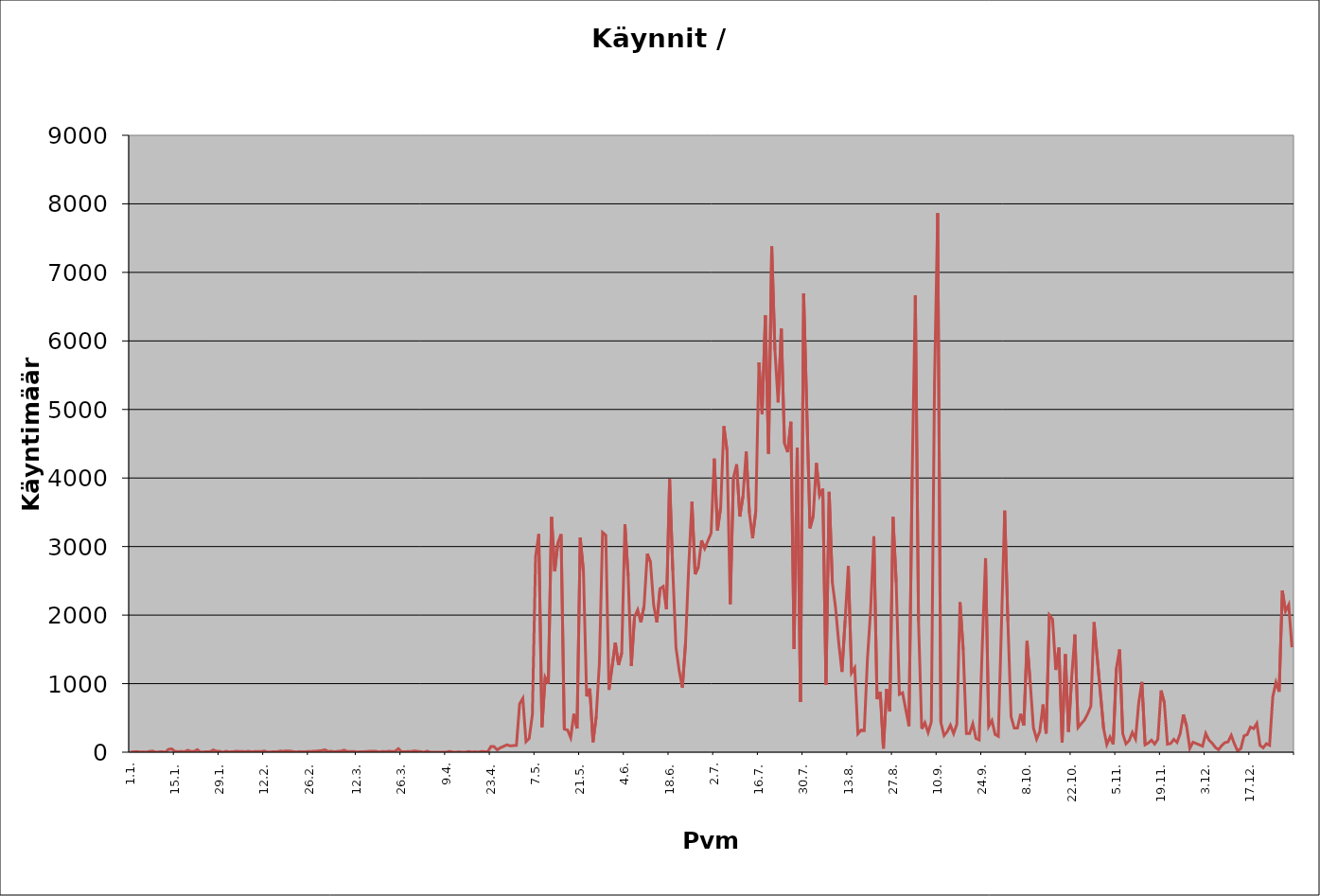
| Category | Series 1 |
|---|---|
| 0 | 3 |
| 1 | 5 |
| 2 | 9 |
| 3 | 2 |
| 4 | 4 |
| 5 | 1 |
| 6 | 12 |
| 7 | 16 |
| 8 | 0 |
| 9 | 5 |
| 10 | 6 |
| 11 | 0 |
| 12 | 42 |
| 13 | 48 |
| 14 | 10 |
| 15 | 8 |
| 16 | 12 |
| 17 | 6 |
| 18 | 28 |
| 19 | 12 |
| 20 | 11 |
| 21 | 37 |
| 22 | 1 |
| 23 | 3 |
| 24 | 8 |
| 25 | 6 |
| 26 | 33 |
| 27 | 12 |
| 28 | 13 |
| 29 | 0 |
| 30 | 14 |
| 31 | 5 |
| 32 | 6 |
| 33 | 13 |
| 34 | 12 |
| 35 | 12 |
| 36 | 7 |
| 37 | 14 |
| 38 | 6 |
| 39 | 10 |
| 40 | 11 |
| 41 | 9 |
| 42 | 18 |
| 43 | 1 |
| 44 | 4 |
| 45 | 8 |
| 46 | 7 |
| 47 | 16 |
| 48 | 13 |
| 49 | 19 |
| 50 | 18 |
| 51 | 8 |
| 52 | 3 |
| 53 | 9 |
| 54 | 7 |
| 55 | 8 |
| 56 | 11 |
| 57 | 12 |
| 58 | 14 |
| 59 | 0 |
| 60 | 24 |
| 61 | 35 |
| 62 | 11 |
| 63 | 13 |
| 64 | 6 |
| 65 | 12 |
| 66 | 14 |
| 67 | 30 |
| 68 | 8 |
| 69 | 11 |
| 70 | 12 |
| 71 | 3 |
| 72 | 7 |
| 73 | 7 |
| 74 | 10 |
| 75 | 13 |
| 76 | 13 |
| 77 | 13 |
| 78 | 3 |
| 79 | 11 |
| 80 | 8 |
| 81 | 14 |
| 82 | 11 |
| 83 | 12 |
| 84 | 51 |
| 85 | 7 |
| 86 | 6 |
| 87 | 10 |
| 88 | 9 |
| 89 | 18 |
| 90 | 0 |
| 91 | 8 |
| 92 | 0 |
| 93 | 15 |
| 94 | 0 |
| 95 | 0 |
| 96 | 0 |
| 97 | 1 |
| 98 | 0 |
| 99 | 1 |
| 100 | 12 |
| 101 | 2 |
| 102 | 0 |
| 103 | 5 |
| 104 | 0 |
| 105 | 0 |
| 106 | 10 |
| 107 | 2 |
| 108 | 6 |
| 109 | 1 |
| 110 | 10 |
| 111 | 8 |
| 112 | 4 |
| 113 | 83 |
| 114 | 82 |
| 115 | 34 |
| 116 | 66 |
| 117 | 85 |
| 118 | 108 |
| 119 | 92 |
| 120 | 0 |
| 121 | 100 |
| 122 | 705 |
| 123 | 785 |
| 124 | 153 |
| 125 | 200 |
| 126 | 550 |
| 127 | 2852 |
| 128 | 3182 |
| 129 | 366 |
| 130 | 1091 |
| 131 | 1000 |
| 132 | 3431 |
| 133 | 2642 |
| 134 | 3055 |
| 135 | 3180 |
| 136 | 336 |
| 137 | 324 |
| 138 | 214 |
| 139 | 560 |
| 140 | 346 |
| 141 | 3130 |
| 142 | 2639 |
| 143 | 814 |
| 144 | 927 |
| 145 | 147 |
| 146 | 520 |
| 147 | 1302 |
| 148 | 3206 |
| 149 | 3165 |
| 150 | 909 |
| 151 | 0 |
| 152 | 1599 |
| 153 | 1271 |
| 154 | 1446 |
| 155 | 3327 |
| 156 | 2577 |
| 157 | 1258 |
| 158 | 1973 |
| 159 | 2076 |
| 160 | 1894 |
| 161 | 2131 |
| 162 | 2896 |
| 163 | 2774 |
| 164 | 2148 |
| 165 | 1894 |
| 166 | 2386 |
| 167 | 2418 |
| 168 | 2084 |
| 169 | 3982 |
| 170 | 2648 |
| 171 | 1527 |
| 172 | 1189 |
| 173 | 943 |
| 174 | 1598 |
| 175 | 2725 |
| 176 | 3653 |
| 177 | 2596 |
| 178 | 2699 |
| 179 | 3090 |
| 180 | 2971 |
| 181 | 0 |
| 182 | 3195 |
| 183 | 4283 |
| 184 | 3233 |
| 185 | 3576 |
| 186 | 4756 |
| 187 | 4398 |
| 188 | 2159 |
| 189 | 4002 |
| 190 | 4200 |
| 191 | 3437 |
| 192 | 3734 |
| 193 | 4386 |
| 194 | 3491 |
| 195 | 3121 |
| 196 | 3515 |
| 197 | 5685 |
| 198 | 4933 |
| 199 | 6372 |
| 200 | 4356 |
| 201 | 7379 |
| 202 | 5868 |
| 203 | 5104 |
| 204 | 6179 |
| 205 | 4505 |
| 206 | 4377 |
| 207 | 4820 |
| 208 | 1504 |
| 209 | 4440 |
| 210 | 732 |
| 211 | 6690 |
| 212 | 0 |
| 213 | 3266 |
| 214 | 3445 |
| 215 | 4218 |
| 216 | 3746 |
| 217 | 3844 |
| 218 | 985 |
| 219 | 3798 |
| 220 | 2471 |
| 221 | 2111 |
| 222 | 1591 |
| 223 | 1172 |
| 224 | 1924 |
| 225 | 2717 |
| 226 | 1155 |
| 227 | 1230 |
| 228 | 270 |
| 229 | 322 |
| 230 | 316 |
| 231 | 1369 |
| 232 | 2082 |
| 233 | 3149 |
| 234 | 774 |
| 235 | 879 |
| 236 | 53 |
| 237 | 920 |
| 238 | 594 |
| 239 | 3431 |
| 240 | 2480 |
| 241 | 845 |
| 242 | 868 |
| 243 | 0 |
| 244 | 379 |
| 245 | 4023 |
| 246 | 6663 |
| 247 | 1912 |
| 248 | 341 |
| 249 | 430 |
| 250 | 287 |
| 251 | 442 |
| 252 | 5363 |
| 253 | 7864 |
| 254 | 434 |
| 255 | 243 |
| 256 | 300 |
| 257 | 394 |
| 258 | 272 |
| 259 | 408 |
| 260 | 2188 |
| 261 | 1492 |
| 262 | 274 |
| 263 | 274 |
| 264 | 415 |
| 265 | 200 |
| 266 | 179 |
| 267 | 1582 |
| 268 | 2831 |
| 269 | 377 |
| 270 | 461 |
| 271 | 260 |
| 272 | 233 |
| 273 | 0 |
| 274 | 3524 |
| 275 | 1907 |
| 276 | 516 |
| 277 | 352 |
| 278 | 351 |
| 279 | 559 |
| 280 | 392 |
| 281 | 1622 |
| 282 | 1014 |
| 283 | 355 |
| 284 | 190 |
| 285 | 301 |
| 286 | 696 |
| 287 | 273 |
| 288 | 2001 |
| 289 | 1940 |
| 290 | 1200 |
| 291 | 1525 |
| 292 | 143 |
| 293 | 1429 |
| 294 | 298 |
| 295 | 1098 |
| 296 | 1716 |
| 297 | 361 |
| 298 | 418 |
| 299 | 471 |
| 300 | 561 |
| 301 | 671 |
| 302 | 1897 |
| 303 | 0 |
| 304 | 0 |
| 305 | 344 |
| 306 | 111 |
| 307 | 221 |
| 308 | 115 |
| 309 | 1226 |
| 310 | 1497 |
| 311 | 269 |
| 312 | 121 |
| 313 | 170 |
| 314 | 288 |
| 315 | 194 |
| 316 | 722 |
| 317 | 1024 |
| 318 | 108 |
| 319 | 134 |
| 320 | 175 |
| 321 | 119 |
| 322 | 189 |
| 323 | 900 |
| 324 | 728 |
| 325 | 117 |
| 326 | 127 |
| 327 | 187 |
| 328 | 142 |
| 329 | 272 |
| 330 | 550 |
| 331 | 380 |
| 332 | 56 |
| 333 | 146 |
| 334 | 0 |
| 335 | 108 |
| 336 | 88 |
| 337 | 273 |
| 338 | 178 |
| 339 | 132 |
| 340 | 71 |
| 341 | 37 |
| 342 | 97 |
| 343 | 139 |
| 344 | 151 |
| 345 | 246 |
| 346 | 119 |
| 347 | 17 |
| 348 | 54 |
| 349 | 238 |
| 350 | 257 |
| 351 | 366 |
| 352 | 343 |
| 353 | 420 |
| 354 | 99 |
| 355 | 64 |
| 356 | 124 |
| 357 | 101 |
| 358 | 805 |
| 359 | 1019 |
| 360 | 882 |
| 361 | 2358 |
| 362 | 2056 |
| 363 | 2152 |
| 364 | 1529 |